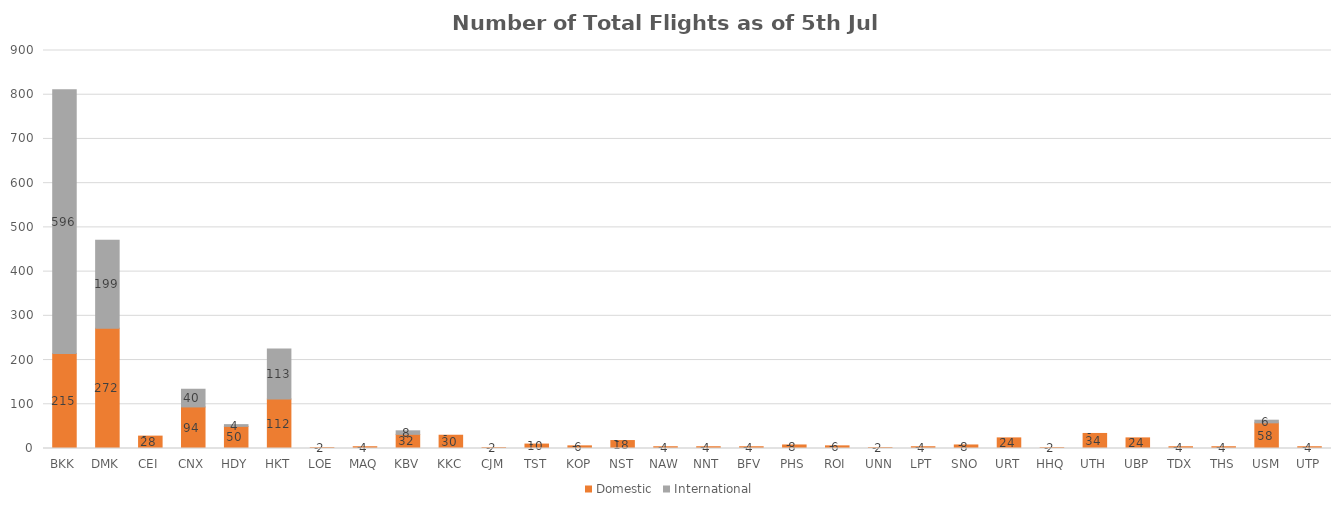
| Category | Domestic | International |
|---|---|---|
| BKK | 215 | 596 |
| DMK | 272 | 199 |
| CEI | 28 | 0 |
| CNX | 94 | 40 |
| HDY | 50 | 4 |
| HKT | 112 | 113 |
| LOE | 2 | 0 |
| MAQ | 4 | 0 |
| KBV | 32 | 8 |
| KKC | 30 | 0 |
| CJM | 2 | 0 |
| TST | 10 | 0 |
| KOP | 6 | 0 |
| NST | 18 | 0 |
| NAW | 4 | 0 |
| NNT | 4 | 0 |
| BFV | 4 | 0 |
| PHS | 8 | 0 |
| ROI | 6 | 0 |
| UNN | 2 | 0 |
| LPT | 4 | 0 |
| SNO | 8 | 0 |
| URT | 24 | 0 |
| HHQ | 2 | 0 |
| UTH | 34 | 0 |
| UBP | 24 | 0 |
| TDX | 4 | 0 |
| THS | 4 | 0 |
| USM | 58 | 6 |
| UTP | 4 | 0 |